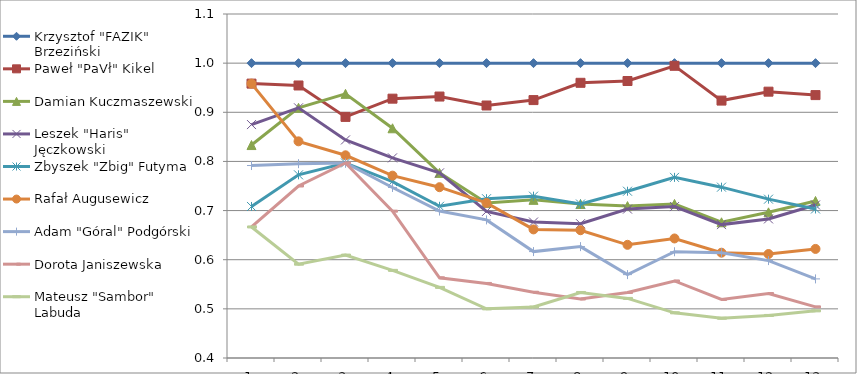
| Category | Krzysztof "FAZIK" Brzeziński | Paweł "PaVł" Kikel | Damian Kuczmaszewski | Leszek "Haris" Jęczkowski | Zbyszek "Zbig" Futyma | Rafał Augusewicz | Adam "Góral" Podgórski | Dorota Janiszewska | Mateusz "Sambor" Labuda |
|---|---|---|---|---|---|---|---|---|---|
| 0 | 1 | 0.958 | 0.833 | 0.875 | 0.708 | 0.958 | 0.792 | 0.667 | 0.667 |
| 1 | 1 | 0.955 | 0.909 | 0.909 | 0.773 | 0.841 | 0.795 | 0.75 | 0.591 |
| 2 | 1 | 0.891 | 0.938 | 0.844 | 0.797 | 0.812 | 0.797 | 0.797 | 0.609 |
| 3 | 1 | 0.928 | 0.867 | 0.807 | 0.759 | 0.771 | 0.747 | 0.699 | 0.578 |
| 4 | 1 | 0.932 | 0.777 | 0.777 | 0.709 | 0.748 | 0.699 | 0.563 | 0.544 |
| 5 | 1 | 0.914 | 0.716 | 0.698 | 0.724 | 0.716 | 0.681 | 0.552 | 0.5 |
| 6 | 1 | 0.925 | 0.722 | 0.677 | 0.729 | 0.662 | 0.617 | 0.534 | 0.504 |
| 7 | 1 | 0.96 | 0.713 | 0.673 | 0.713 | 0.66 | 0.627 | 0.52 | 0.533 |
| 8 | 1 | 0.964 | 0.709 | 0.703 | 0.739 | 0.63 | 0.57 | 0.533 | 0.521 |
| 9 | 1 | 0.995 | 0.714 | 0.708 | 0.768 | 0.643 | 0.616 | 0.557 | 0.492 |
| 10 | 1 | 0.924 | 0.676 | 0.671 | 0.748 | 0.614 | 0.614 | 0.519 | 0.481 |
| 11 | 1 | 0.942 | 0.696 | 0.683 | 0.723 | 0.612 | 0.598 | 0.531 | 0.487 |
| 12 | 1 | 0.935 | 0.72 | 0.711 | 0.703 | 0.622 | 0.561 | 0.504 | 0.496 |